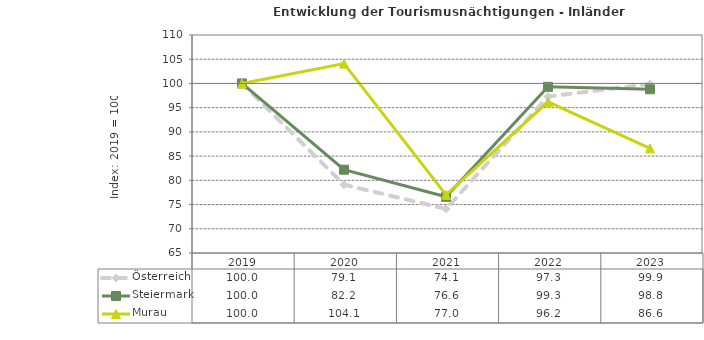
| Category | Österreich | Steiermark | Murau |
|---|---|---|---|
| 2023.0 | 99.9 | 98.8 | 86.6 |
| 2022.0 | 97.3 | 99.3 | 96.2 |
| 2021.0 | 74.1 | 76.6 | 77 |
| 2020.0 | 79.1 | 82.2 | 104.1 |
| 2019.0 | 100 | 100 | 100 |